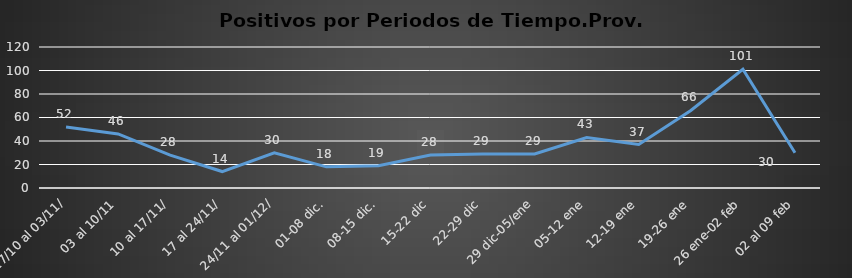
| Category | Prov. Castilla |
|---|---|
| 27/10 al 03/11/ | 52 |
| 03 al 10/11 | 46 |
| 10 al 17/11/ | 28 |
|  17 al 24/11/ | 14 |
|  24/11 al 01/12/ | 30 |
| 01-08 dic. | 18 |
| 08-15 dic. | 19 |
| 15-22 dic | 28 |
| 22-29 dic | 29 |
| 29 dic-05/ene | 29 |
| 05-12 ene | 43 |
| 12-19 ene | 37 |
| 19-26 ene | 66 |
| 26 ene-02 feb | 101 |
| 02 al 09 feb | 30 |